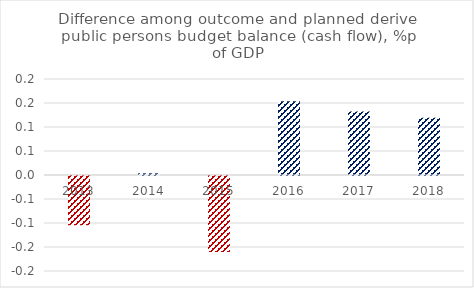
| Category | Series 0 |
|---|---|
| 2013.0 | -0.103 |
| 2014.0 | 0.003 |
| 2015.0 | -0.158 |
| 2016.0 | 0.154 |
| 2017.0 | 0.132 |
| 2018.0 | 0.119 |